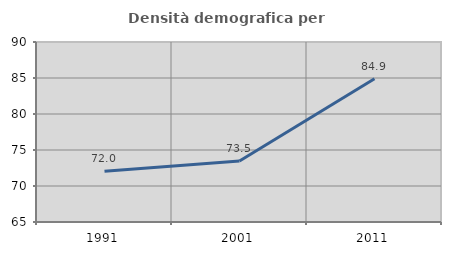
| Category | Densità demografica |
|---|---|
| 1991.0 | 72.042 |
| 2001.0 | 73.465 |
| 2011.0 | 84.909 |